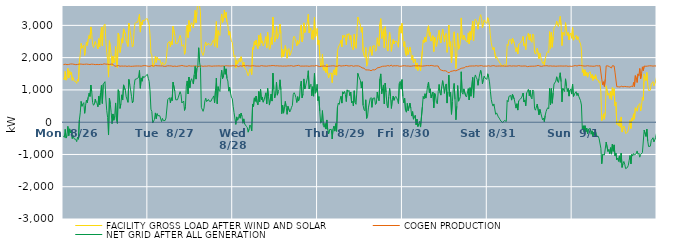
| Category | FACILITY GROSS LOAD AFTER WIND AND SOLAR | COGEN PRODUCTION | NET GRID AFTER ALL GENERATION |
|---|---|---|---|
|  Mon  8/26 | 1358 | 1783 | -425 |
|  Mon  8/26 | 1316 | 1786 | -470 |
|  Mon  8/26 | 1574 | 1796 | -222 |
|  Mon  8/26 | 1303 | 1795 | -492 |
|  Mon  8/26 | 1369 | 1783 | -414 |
|  Mon  8/26 | 1669 | 1799 | -130 |
|  Mon  8/26 | 1369 | 1789 | -420 |
|  Mon  8/26 | 1591 | 1798 | -207 |
|  Mon  8/26 | 1475 | 1802 | -327 |
|  Mon  8/26 | 1544 | 1790 | -246 |
|  Mon  8/26 | 1298 | 1803 | -505 |
|  Mon  8/26 | 1380 | 1794 | -414 |
|  Mon  8/26 | 1280 | 1793 | -513 |
|  Mon  8/26 | 1264 | 1791 | -527 |
|  Mon  8/26 | 1251 | 1782 | -531 |
|  Mon  8/26 | 1202 | 1805 | -603 |
|  Mon  8/26 | 1325 | 1789 | -464 |
|  Mon  8/26 | 1268 | 1798 | -530 |
|  Mon  8/26 | 1870 | 1800 | 70 |
|  Mon  8/26 | 2092 | 1803 | 289 |
|  Mon  8/26 | 2443 | 1800 | 643 |
|  Mon  8/26 | 2288 | 1797 | 491 |
|  Mon  8/26 | 2359 | 1792 | 567 |
|  Mon  8/26 | 2393 | 1788 | 605 |
|  Mon  8/26 | 2069 | 1794 | 275 |
|  Mon  8/26 | 2311 | 1796 | 515 |
|  Mon  8/26 | 2485 | 1800 | 685 |
|  Mon  8/26 | 2379 | 1775 | 604 |
|  Mon  8/26 | 2568 | 1794 | 774 |
|  Mon  8/26 | 2690 | 1793 | 897 |
|  Mon  8/26 | 2583 | 1786 | 797 |
|  Mon  8/26 | 2952 | 1800 | 1152 |
|  Mon  8/26 | 2745 | 1799 | 946 |
|  Mon  8/26 | 2401 | 1796 | 605 |
|  Mon  8/26 | 2317 | 1793 | 524 |
|  Mon  8/26 | 2336 | 1772 | 564 |
|  Mon  8/26 | 2500 | 1784 | 716 |
|  Mon  8/26 | 2402 | 1793 | 609 |
|  Mon  8/26 | 2364 | 1790 | 574 |
|  Mon  8/26 | 2271 | 1794 | 477 |
|  Mon  8/26 | 2589 | 1784 | 805 |
|  Mon  8/26 | 2331 | 1790 | 541 |
|  Mon  8/26 | 2705 | 1792 | 913 |
|  Mon  8/26 | 2941 | 1801 | 1140 |
|  Mon  8/26 | 2368 | 1788 | 580 |
|  Mon  8/26 | 2959 | 1786 | 1173 |
|  Mon  8/26 | 2982 | 1809 | 1173 |
|  Mon  8/26 | 3039 | 1784 | 1255 |
|  Mon  8/26 | 2516 | 1798 | 718 |
|  Mon  8/26 | 2153 | 1795 | 358 |
|  Mon  8/26 | 1938 | 1797 | 141 |
|  Mon  8/26 | 1396 | 1794 | -398 |
|  Mon  8/26 | 2524 | 1785 | 739 |
|  Mon  8/26 | 2341 | 1775 | 566 |
|  Mon  8/26 | 2102 | 1800 | 302 |
|  Mon  8/26 | 1739 | 1786 | -47 |
|  Mon  8/26 | 2051 | 1796 | 255 |
|  Mon  8/26 | 1841 | 1782 | 59 |
|  Mon  8/26 | 1919 | 1735 | 184 |
|  Mon  8/26 | 2344 | 1748 | 596 |
|  Mon  8/26 | 1811 | 1740 | 71 |
|  Mon  8/26 | 1690 | 1729 | -39 |
|  Mon  8/26 | 2760 | 1755 | 1005 |
|  Mon  8/26 | 2671 | 1738 | 933 |
|  Mon  8/26 | 2159 | 1734 | 425 |
|  Mon  8/26 | 2326 | 1752 | 574 |
|  Mon  8/26 | 2588 | 1740 | 848 |
|  Mon  8/26 | 2451 | 1765 | 686 |
|  Mon  8/26 | 2892 | 1736 | 1156 |
|  Mon  8/26 | 2875 | 1741 | 1134 |
|  Mon  8/26 | 2735 | 1741 | 994 |
|  Mon  8/26 | 2524 | 1738 | 786 |
|  Mon  8/26 | 2504 | 1729 | 775 |
|  Mon  8/26 | 2346 | 1731 | 615 |
|  Mon  8/26 | 3065 | 1741 | 1324 |
|  Mon  8/26 | 2905 | 1737 | 1168 |
|  Mon  8/26 | 2730 | 1730 | 1000 |
|  Mon  8/26 | 2543 | 1740 | 803 |
|  Mon  8/26 | 2328 | 1732 | 596 |
|  Mon  8/26 | 2400 | 1731 | 669 |
|  Mon  8/26 | 2871 | 1737 | 1134 |
|  Mon  8/26 | 3061 | 1737 | 1324 |
|  Mon  8/26 | 3093 | 1740 | 1353 |
|  Mon  8/26 | 3083 | 1736 | 1347 |
|  Mon  8/26 | 3101 | 1741 | 1360 |
|  Mon  8/26 | 3125 | 1739 | 1386 |
|  Mon  8/26 | 3342 | 1740 | 1602 |
|  Mon  8/26 | 2791 | 1740 | 1051 |
|  Mon  8/26 | 3107 | 1735 | 1372 |
|  Mon  8/26 | 3017 | 1748 | 1269 |
|  Mon  8/26 | 3166 | 1747 | 1419 |
|  Mon  8/26 | 3131 | 1753 | 1378 |
|  Mon  8/26 | 3105 | 1754 | 1351 |
|  Mon  8/26 | 3194 | 1756 | 1438 |
|  Mon  8/26 | 3183 | 1744 | 1439 |
|  Mon  8/26 | 3205 | 1724 | 1481 |
|  Tue  8/27 | 3090 | 1732 | 1358 |
|  Tue  8/27 | 3007 | 1746 | 1261 |
|  Tue  8/27 | 2693 | 1733 | 960 |
|  Tue  8/27 | 2141 | 1741 | 400 |
|  Tue  8/27 | 2087 | 1754 | 333 |
|  Tue  8/27 | 1714 | 1740 | -26 |
|  Tue  8/27 | 1722 | 1735 | -13 |
|  Tue  8/27 | 1836 | 1748 | 88 |
|  Tue  8/27 | 2041 | 1754 | 287 |
|  Tue  8/27 | 1852 | 1744 | 108 |
|  Tue  8/27 | 2014 | 1748 | 266 |
|  Tue  8/27 | 1944 | 1741 | 203 |
|  Tue  8/27 | 1960 | 1745 | 215 |
|  Tue  8/27 | 1945 | 1745 | 200 |
|  Tue  8/27 | 1926 | 1743 | 183 |
|  Tue  8/27 | 1766 | 1747 | 19 |
|  Tue  8/27 | 1861 | 1743 | 118 |
|  Tue  8/27 | 1791 | 1743 | 48 |
|  Tue  8/27 | 1767 | 1730 | 37 |
|  Tue  8/27 | 1795 | 1743 | 52 |
|  Tue  8/27 | 1861 | 1733 | 128 |
|  Tue  8/27 | 1866 | 1743 | 123 |
|  Tue  8/27 | 2447 | 1748 | 699 |
|  Tue  8/27 | 2430 | 1738 | 692 |
|  Tue  8/27 | 2503 | 1745 | 758 |
|  Tue  8/27 | 2336 | 1734 | 602 |
|  Tue  8/27 | 2501 | 1743 | 758 |
|  Tue  8/27 | 2406 | 1737 | 669 |
|  Tue  8/27 | 2970 | 1729 | 1241 |
|  Tue  8/27 | 2975 | 1758 | 1217 |
|  Tue  8/27 | 2698 | 1738 | 960 |
|  Tue  8/27 | 2442 | 1748 | 694 |
|  Tue  8/27 | 2450 | 1727 | 723 |
|  Tue  8/27 | 2439 | 1745 | 694 |
|  Tue  8/27 | 2515 | 1739 | 776 |
|  Tue  8/27 | 2529 | 1736 | 793 |
|  Tue  8/27 | 2690 | 1744 | 946 |
|  Tue  8/27 | 2597 | 1741 | 856 |
|  Tue  8/27 | 2352 | 1758 | 594 |
|  Tue  8/27 | 2348 | 1737 | 611 |
|  Tue  8/27 | 2399 | 1743 | 656 |
|  Tue  8/27 | 2104 | 1740 | 364 |
|  Tue  8/27 | 2209 | 1735 | 474 |
|  Tue  8/27 | 2864 | 1746 | 1118 |
|  Tue  8/27 | 3009 | 1731 | 1278 |
|  Tue  8/27 | 2622 | 1747 | 875 |
|  Tue  8/27 | 3149 | 1750 | 1399 |
|  Tue  8/27 | 2811 | 1745 | 1066 |
|  Tue  8/27 | 3020 | 1738 | 1282 |
|  Tue  8/27 | 3081 | 1734 | 1347 |
|  Tue  8/27 | 2997 | 1738 | 1259 |
|  Tue  8/27 | 2925 | 1743 | 1182 |
|  Tue  8/27 | 3214 | 1741 | 1473 |
|  Tue  8/27 | 3467 | 1736 | 1731 |
|  Tue  8/27 | 3080 | 1745 | 1335 |
|  Tue  8/27 | 3420 | 1748 | 1672 |
|  Tue  8/27 | 3441 | 1721 | 1720 |
|  Tue  8/27 | 4053 | 1747 | 2306 |
|  Tue  8/27 | 3587 | 1735 | 1852 |
|  Tue  8/27 | 3427 | 1735 | 1692 |
|  Tue  8/27 | 2204 | 1744 | 460 |
|  Tue  8/27 | 2211 | 1745 | 466 |
|  Tue  8/27 | 2066 | 1730 | 336 |
|  Tue  8/27 | 2170 | 1737 | 433 |
|  Tue  8/27 | 2394 | 1739 | 655 |
|  Tue  8/27 | 2485 | 1741 | 744 |
|  Tue  8/27 | 2372 | 1735 | 637 |
|  Tue  8/27 | 2366 | 1745 | 621 |
|  Tue  8/27 | 2450 | 1746 | 704 |
|  Tue  8/27 | 2395 | 1745 | 650 |
|  Tue  8/27 | 2373 | 1741 | 632 |
|  Tue  8/27 | 2387 | 1737 | 650 |
|  Tue  8/27 | 2455 | 1733 | 722 |
|  Tue  8/27 | 2516 | 1759 | 757 |
|  Tue  8/27 | 2554 | 1740 | 814 |
|  Tue  8/27 | 2350 | 1749 | 601 |
|  Tue  8/27 | 2728 | 1741 | 987 |
|  Tue  8/27 | 3120 | 1751 | 1369 |
|  Tue  8/27 | 2315 | 1742 | 573 |
|  Tue  8/27 | 2839 | 1739 | 1100 |
|  Tue  8/27 | 2730 | 1745 | 985 |
|  Tue  8/27 | 2686 | 1733 | 953 |
|  Tue  8/27 | 3122 | 1738 | 1384 |
|  Tue  8/27 | 3353 | 1742 | 1611 |
|  Tue  8/27 | 3089 | 1743 | 1346 |
|  Tue  8/27 | 3139 | 1747 | 1392 |
|  Tue  8/27 | 3475 | 1738 | 1737 |
|  Tue  8/27 | 3226 | 1742 | 1484 |
|  Tue  8/27 | 3402 | 1749 | 1653 |
|  Tue  8/27 | 3104 | 1750 | 1354 |
|  Tue  8/27 | 3018 | 1744 | 1274 |
|  Tue  8/27 | 2697 | 1735 | 962 |
|  Tue  8/27 | 2825 | 1741 | 1084 |
|  Tue  8/27 | 2643 | 1741 | 902 |
|  Tue  8/27 | 2520 | 1743 | 777 |
|  Tue  8/27 | 2472 | 1746 | 726 |
|  Wed  8/28 | 2242 | 1750 | 492 |
|  Wed  8/28 | 2026 | 1729 | 297 |
|  Wed  8/28 | 2064 | 1740 | 324 |
|  Wed  8/28 | 1679 | 1747 | -68 |
|  Wed  8/28 | 1914 | 1751 | 163 |
|  Wed  8/28 | 1803 | 1743 | 60 |
|  Wed  8/28 | 1830 | 1723 | 107 |
|  Wed  8/28 | 1980 | 1735 | 245 |
|  Wed  8/28 | 1870 | 1747 | 123 |
|  Wed  8/28 | 2028 | 1748 | 280 |
|  Wed  8/28 | 1915 | 1736 | 179 |
|  Wed  8/28 | 1706 | 1739 | -33 |
|  Wed  8/28 | 1858 | 1756 | 102 |
|  Wed  8/28 | 1681 | 1734 | -53 |
|  Wed  8/28 | 1700 | 1746 | -46 |
|  Wed  8/28 | 1603 | 1734 | -131 |
|  Wed  8/28 | 1581 | 1751 | -170 |
|  Wed  8/28 | 1434 | 1743 | -309 |
|  Wed  8/28 | 1524 | 1742 | -218 |
|  Wed  8/28 | 1649 | 1736 | -87 |
|  Wed  8/28 | 1596 | 1740 | -144 |
|  Wed  8/28 | 1475 | 1745 | -270 |
|  Wed  8/28 | 2314 | 1750 | 564 |
|  Wed  8/28 | 2243 | 1756 | 487 |
|  Wed  8/28 | 2499 | 1745 | 754 |
|  Wed  8/28 | 2391 | 1744 | 647 |
|  Wed  8/28 | 2547 | 1737 | 810 |
|  Wed  8/28 | 2349 | 1738 | 611 |
|  Wed  8/28 | 2275 | 1738 | 537 |
|  Wed  8/28 | 2698 | 1748 | 950 |
|  Wed  8/28 | 2370 | 1735 | 635 |
|  Wed  8/28 | 2746 | 1731 | 1015 |
|  Wed  8/28 | 2451 | 1753 | 698 |
|  Wed  8/28 | 2520 | 1739 | 781 |
|  Wed  8/28 | 2361 | 1742 | 619 |
|  Wed  8/28 | 2434 | 1745 | 689 |
|  Wed  8/28 | 2540 | 1739 | 801 |
|  Wed  8/28 | 2652 | 1742 | 910 |
|  Wed  8/28 | 2304 | 1736 | 568 |
|  Wed  8/28 | 2788 | 1738 | 1050 |
|  Wed  8/28 | 2544 | 1746 | 798 |
|  Wed  8/28 | 2258 | 1728 | 530 |
|  Wed  8/28 | 2290 | 1746 | 544 |
|  Wed  8/28 | 2621 | 1749 | 872 |
|  Wed  8/28 | 2408 | 1754 | 654 |
|  Wed  8/28 | 3259 | 1739 | 1520 |
|  Wed  8/28 | 2771 | 1753 | 1018 |
|  Wed  8/28 | 2485 | 1734 | 751 |
|  Wed  8/28 | 2635 | 1745 | 890 |
|  Wed  8/28 | 2973 | 1732 | 1241 |
|  Wed  8/28 | 2585 | 1748 | 837 |
|  Wed  8/28 | 2703 | 1753 | 950 |
|  Wed  8/28 | 2753 | 1740 | 1013 |
|  Wed  8/28 | 3042 | 1729 | 1313 |
|  Wed  8/28 | 2748 | 1743 | 1005 |
|  Wed  8/28 | 2010 | 1747 | 263 |
|  Wed  8/28 | 2257 | 1736 | 521 |
|  Wed  8/28 | 2027 | 1747 | 280 |
|  Wed  8/28 | 2221 | 1740 | 481 |
|  Wed  8/28 | 2376 | 1733 | 643 |
|  Wed  8/28 | 2207 | 1737 | 470 |
|  Wed  8/28 | 1979 | 1735 | 244 |
|  Wed  8/28 | 2237 | 1746 | 491 |
|  Wed  8/28 | 2281 | 1772 | 509 |
|  Wed  8/28 | 2062 | 1745 | 317 |
|  Wed  8/28 | 2112 | 1745 | 367 |
|  Wed  8/28 | 2214 | 1751 | 463 |
|  Wed  8/28 | 2260 | 1742 | 518 |
|  Wed  8/28 | 2593 | 1732 | 861 |
|  Wed  8/28 | 2664 | 1751 | 913 |
|  Wed  8/28 | 2598 | 1742 | 856 |
|  Wed  8/28 | 2504 | 1744 | 760 |
|  Wed  8/28 | 2364 | 1753 | 611 |
|  Wed  8/28 | 2529 | 1738 | 791 |
|  Wed  8/28 | 2416 | 1761 | 655 |
|  Wed  8/28 | 2466 | 1744 | 722 |
|  Wed  8/28 | 2854 | 1737 | 1117 |
|  Wed  8/28 | 3013 | 1742 | 1271 |
|  Wed  8/28 | 2493 | 1738 | 755 |
|  Wed  8/28 | 2618 | 1747 | 871 |
|  Wed  8/28 | 3078 | 1737 | 1341 |
|  Wed  8/28 | 2776 | 1749 | 1027 |
|  Wed  8/28 | 2870 | 1740 | 1130 |
|  Wed  8/28 | 2863 | 1732 | 1131 |
|  Wed  8/28 | 3112 | 1739 | 1373 |
|  Wed  8/28 | 3344 | 1750 | 1594 |
|  Wed  8/28 | 2764 | 1731 | 1033 |
|  Wed  8/28 | 2883 | 1751 | 1132 |
|  Wed  8/28 | 2917 | 1742 | 1175 |
|  Wed  8/28 | 2568 | 1752 | 816 |
|  Wed  8/28 | 2843 | 1744 | 1099 |
|  Wed  8/28 | 2556 | 1751 | 805 |
|  Wed  8/28 | 3249 | 1740 | 1509 |
|  Wed  8/28 | 2636 | 1739 | 897 |
|  Wed  8/28 | 2711 | 1756 | 955 |
|  Wed  8/28 | 2906 | 1733 | 1173 |
|  Thu  8/29 | 2405 | 1738 | 667 |
|  Thu  8/29 | 2542 | 1750 | 792 |
|  Thu  8/29 | 2059 | 1723 | 336 |
|  Thu  8/29 | 1709 | 1739 | -30 |
|  Thu  8/29 | 1782 | 1734 | 48 |
|  Thu  8/29 | 2113 | 1754 | 359 |
|  Thu  8/29 | 1640 | 1738 | -98 |
|  Thu  8/29 | 1597 | 1755 | -158 |
|  Thu  8/29 | 1709 | 1744 | -35 |
|  Thu  8/29 | 1538 | 1752 | -214 |
|  Thu  8/29 | 1796 | 1727 | 69 |
|  Thu  8/29 | 1495 | 1733 | -238 |
|  Thu  8/29 | 1374 | 1736 | -362 |
|  Thu  8/29 | 1506 | 1738 | -232 |
|  Thu  8/29 | 1520 | 1740 | -220 |
|  Thu  8/29 | 1524 | 1746 | -222 |
|  Thu  8/29 | 1226 | 1746 | -520 |
|  Thu  8/29 | 1527 | 1742 | -215 |
|  Thu  8/29 | 1625 | 1746 | -121 |
|  Thu  8/29 | 1463 | 1740 | -277 |
|  Thu  8/29 | 1689 | 1734 | -45 |
|  Thu  8/29 | 1454 | 1738 | -284 |
|  Thu  8/29 | 2201 | 1734 | 467 |
|  Thu  8/29 | 2332 | 1738 | 594 |
|  Thu  8/29 | 2308 | 1758 | 550 |
|  Thu  8/29 | 2438 | 1730 | 708 |
|  Thu  8/29 | 2541 | 1738 | 803 |
|  Thu  8/29 | 2334 | 1743 | 591 |
|  Thu  8/29 | 2686 | 1746 | 940 |
|  Thu  8/29 | 2628 | 1747 | 881 |
|  Thu  8/29 | 2702 | 1749 | 953 |
|  Thu  8/29 | 2606 | 1749 | 857 |
|  Thu  8/29 | 2398 | 1759 | 639 |
|  Thu  8/29 | 2734 | 1732 | 1002 |
|  Thu  8/29 | 2695 | 1743 | 952 |
|  Thu  8/29 | 2748 | 1762 | 986 |
|  Thu  8/29 | 2564 | 1742 | 822 |
|  Thu  8/29 | 2686 | 1752 | 934 |
|  Thu  8/29 | 2356 | 1754 | 602 |
|  Thu  8/29 | 2372 | 1727 | 645 |
|  Thu  8/29 | 2236 | 1732 | 504 |
|  Thu  8/29 | 2725 | 1752 | 973 |
|  Thu  8/29 | 2352 | 1745 | 607 |
|  Thu  8/29 | 2290 | 1736 | 554 |
|  Thu  8/29 | 2736 | 1745 | 991 |
|  Thu  8/29 | 3257 | 1743 | 1514 |
|  Thu  8/29 | 3165 | 1742 | 1423 |
|  Thu  8/29 | 3183 | 1744 | 1439 |
|  Thu  8/29 | 3005 | 1719 | 1286 |
|  Thu  8/29 | 2786 | 1728 | 1058 |
|  Thu  8/29 | 2937 | 1683 | 1254 |
|  Thu  8/29 | 2188 | 1666 | 522 |
|  Thu  8/29 | 2063 | 1672 | 391 |
|  Thu  8/29 | 2009 | 1655 | 354 |
|  Thu  8/29 | 2314 | 1620 | 694 |
|  Thu  8/29 | 1736 | 1621 | 115 |
|  Thu  8/29 | 1787 | 1619 | 168 |
|  Thu  8/29 | 2062 | 1619 | 443 |
|  Thu  8/29 | 2089 | 1616 | 473 |
|  Thu  8/29 | 2339 | 1610 | 729 |
|  Thu  8/29 | 2356 | 1594 | 762 |
|  Thu  8/29 | 2072 | 1612 | 460 |
|  Thu  8/29 | 2361 | 1625 | 736 |
|  Thu  8/29 | 2368 | 1624 | 744 |
|  Thu  8/29 | 2375 | 1620 | 755 |
|  Thu  8/29 | 2196 | 1648 | 548 |
|  Thu  8/29 | 2228 | 1648 | 580 |
|  Thu  8/29 | 2615 | 1684 | 931 |
|  Thu  8/29 | 2417 | 1669 | 748 |
|  Thu  8/29 | 2356 | 1692 | 664 |
|  Thu  8/29 | 3035 | 1697 | 1338 |
|  Thu  8/29 | 3208 | 1711 | 1497 |
|  Thu  8/29 | 2594 | 1717 | 877 |
|  Thu  8/29 | 2767 | 1732 | 1035 |
|  Thu  8/29 | 2893 | 1738 | 1155 |
|  Thu  8/29 | 2303 | 1736 | 567 |
|  Thu  8/29 | 2959 | 1746 | 1213 |
|  Thu  8/29 | 2666 | 1737 | 929 |
|  Thu  8/29 | 2276 | 1745 | 531 |
|  Thu  8/29 | 2203 | 1755 | 448 |
|  Thu  8/29 | 2539 | 1748 | 791 |
|  Thu  8/29 | 2785 | 1739 | 1046 |
|  Thu  8/29 | 2525 | 1732 | 793 |
|  Thu  8/29 | 2196 | 1770 | 426 |
|  Thu  8/29 | 2422 | 1734 | 688 |
|  Thu  8/29 | 2564 | 1754 | 810 |
|  Thu  8/29 | 2427 | 1749 | 678 |
|  Thu  8/29 | 2514 | 1749 | 765 |
|  Thu  8/29 | 2544 | 1746 | 798 |
|  Thu  8/29 | 2499 | 1741 | 758 |
|  Thu  8/29 | 2431 | 1751 | 680 |
|  Thu  8/29 | 2323 | 1745 | 578 |
|  Thu  8/29 | 2934 | 1733 | 1201 |
|  Thu  8/29 | 2989 | 1726 | 1263 |
|  Thu  8/29 | 2757 | 1733 | 1024 |
|  Thu  8/29 | 3064 | 1745 | 1319 |
|  Fri  8/30 | 2544 | 1747 | 797 |
|  Fri  8/30 | 2344 | 1747 | 597 |
|  Fri  8/30 | 2498 | 1751 | 747 |
|  Fri  8/30 | 2121 | 1757 | 364 |
|  Fri  8/30 | 2048 | 1740 | 308 |
|  Fri  8/30 | 2319 | 1735 | 584 |
|  Fri  8/30 | 2098 | 1741 | 357 |
|  Fri  8/30 | 2100 | 1744 | 356 |
|  Fri  8/30 | 2322 | 1733 | 589 |
|  Fri  8/30 | 2168 | 1737 | 431 |
|  Fri  8/30 | 1927 | 1737 | 190 |
|  Fri  8/30 | 2065 | 1737 | 328 |
|  Fri  8/30 | 1838 | 1747 | 91 |
|  Fri  8/30 | 1821 | 1750 | 71 |
|  Fri  8/30 | 1958 | 1747 | 211 |
|  Fri  8/30 | 1659 | 1741 | -82 |
|  Fri  8/30 | 1836 | 1743 | 93 |
|  Fri  8/30 | 1602 | 1737 | -135 |
|  Fri  8/30 | 1699 | 1748 | -49 |
|  Fri  8/30 | 1761 | 1738 | 23 |
|  Fri  8/30 | 1589 | 1740 | -151 |
|  Fri  8/30 | 1596 | 1751 | -155 |
|  Fri  8/30 | 2205 | 1737 | 468 |
|  Fri  8/30 | 2549 | 1753 | 796 |
|  Fri  8/30 | 2467 | 1743 | 724 |
|  Fri  8/30 | 2635 | 1753 | 882 |
|  Fri  8/30 | 2496 | 1750 | 746 |
|  Fri  8/30 | 2665 | 1753 | 912 |
|  Fri  8/30 | 2891 | 1754 | 1137 |
|  Fri  8/30 | 2989 | 1744 | 1245 |
|  Fri  8/30 | 2664 | 1749 | 915 |
|  Fri  8/30 | 2777 | 1743 | 1034 |
|  Fri  8/30 | 2513 | 1760 | 753 |
|  Fri  8/30 | 2590 | 1740 | 850 |
|  Fri  8/30 | 2682 | 1749 | 933 |
|  Fri  8/30 | 2190 | 1745 | 445 |
|  Fri  8/30 | 2627 | 1737 | 890 |
|  Fri  8/30 | 2555 | 1739 | 816 |
|  Fri  8/30 | 2347 | 1744 | 603 |
|  Fri  8/30 | 2330 | 1761 | 569 |
|  Fri  8/30 | 2694 | 1739 | 955 |
|  Fri  8/30 | 2847 | 1678 | 1169 |
|  Fri  8/30 | 2541 | 1631 | 910 |
|  Fri  8/30 | 2452 | 1614 | 838 |
|  Fri  8/30 | 2716 | 1607 | 1109 |
|  Fri  8/30 | 2885 | 1598 | 1287 |
|  Fri  8/30 | 2689 | 1592 | 1097 |
|  Fri  8/30 | 2490 | 1596 | 894 |
|  Fri  8/30 | 2706 | 1595 | 1111 |
|  Fri  8/30 | 2753 | 1568 | 1185 |
|  Fri  8/30 | 2163 | 1571 | 592 |
|  Fri  8/30 | 2473 | 1537 | 936 |
|  Fri  8/30 | 3010 | 1550 | 1460 |
|  Fri  8/30 | 2345 | 1543 | 802 |
|  Fri  8/30 | 2495 | 1574 | 921 |
|  Fri  8/30 | 1835 | 1591 | 244 |
|  Fri  8/30 | 2216 | 1583 | 633 |
|  Fri  8/30 | 2609 | 1596 | 1013 |
|  Fri  8/30 | 2800 | 1600 | 1200 |
|  Fri  8/30 | 2319 | 1613 | 706 |
|  Fri  8/30 | 1664 | 1590 | 74 |
|  Fri  8/30 | 2102 | 1606 | 496 |
|  Fri  8/30 | 2751 | 1616 | 1135 |
|  Fri  8/30 | 2260 | 1611 | 649 |
|  Fri  8/30 | 2337 | 1639 | 698 |
|  Fri  8/30 | 2458 | 1661 | 797 |
|  Fri  8/30 | 3231 | 1669 | 1562 |
|  Fri  8/30 | 2596 | 1674 | 922 |
|  Fri  8/30 | 2546 | 1679 | 867 |
|  Fri  8/30 | 2696 | 1663 | 1033 |
|  Fri  8/30 | 2712 | 1689 | 1023 |
|  Fri  8/30 | 2537 | 1722 | 815 |
|  Fri  8/30 | 2523 | 1743 | 780 |
|  Fri  8/30 | 2478 | 1720 | 758 |
|  Fri  8/30 | 2767 | 1726 | 1041 |
|  Fri  8/30 | 2426 | 1737 | 689 |
|  Fri  8/30 | 2810 | 1741 | 1069 |
|  Fri  8/30 | 2544 | 1740 | 804 |
|  Fri  8/30 | 2532 | 1738 | 794 |
|  Fri  8/30 | 3128 | 1742 | 1386 |
|  Fri  8/30 | 2515 | 1753 | 762 |
|  Fri  8/30 | 3099 | 1740 | 1359 |
|  Fri  8/30 | 3197 | 1733 | 1464 |
|  Fri  8/30 | 3138 | 1751 | 1387 |
|  Fri  8/30 | 3078 | 1748 | 1330 |
|  Fri  8/30 | 2881 | 1738 | 1143 |
|  Fri  8/30 | 3090 | 1742 | 1348 |
|  Fri  8/30 | 3251 | 1748 | 1503 |
|  Fri  8/30 | 3332 | 1727 | 1605 |
|  Fri  8/30 | 3215 | 1753 | 1462 |
|  Fri  8/30 | 2920 | 1732 | 1188 |
|  Fri  8/30 | 3061 | 1734 | 1327 |
|  Fri  8/30 | 3170 | 1741 | 1429 |
|  Fri  8/30 | 3103 | 1739 | 1364 |
|  Fri  8/30 | 3073 | 1736 | 1337 |
|  Fri  8/30 | 3065 | 1736 | 1329 |
|  Sat  8/31 | 3239 | 1740 | 1499 |
|  Sat  8/31 | 3143 | 1749 | 1394 |
|  Sat  8/31 | 2988 | 1739 | 1249 |
|  Sat  8/31 | 2692 | 1733 | 959 |
|  Sat  8/31 | 2462 | 1758 | 704 |
|  Sat  8/31 | 2322 | 1747 | 575 |
|  Sat  8/31 | 2240 | 1742 | 498 |
|  Sat  8/31 | 2318 | 1752 | 566 |
|  Sat  8/31 | 2328 | 1741 | 587 |
|  Sat  8/31 | 1979 | 1736 | 243 |
|  Sat  8/31 | 2030 | 1742 | 288 |
|  Sat  8/31 | 2036 | 1738 | 298 |
|  Sat  8/31 | 1906 | 1743 | 163 |
|  Sat  8/31 | 1867 | 1741 | 126 |
|  Sat  8/31 | 1829 | 1754 | 75 |
|  Sat  8/31 | 1770 | 1739 | 31 |
|  Sat  8/31 | 1760 | 1754 | 6 |
|  Sat  8/31 | 1730 | 1743 | -13 |
|  Sat  8/31 | 1724 | 1739 | -15 |
|  Sat  8/31 | 1791 | 1737 | 54 |
|  Sat  8/31 | 1781 | 1735 | 46 |
|  Sat  8/31 | 1756 | 1735 | 21 |
|  Sat  8/31 | 2413 | 1738 | 675 |
|  Sat  8/31 | 2369 | 1739 | 630 |
|  Sat  8/31 | 2544 | 1744 | 800 |
|  Sat  8/31 | 2521 | 1747 | 774 |
|  Sat  8/31 | 2563 | 1736 | 827 |
|  Sat  8/31 | 2420 | 1737 | 683 |
|  Sat  8/31 | 2602 | 1736 | 866 |
|  Sat  8/31 | 2626 | 1744 | 882 |
|  Sat  8/31 | 2457 | 1744 | 713 |
|  Sat  8/31 | 2450 | 1740 | 710 |
|  Sat  8/31 | 2186 | 1750 | 436 |
|  Sat  8/31 | 2309 | 1738 | 571 |
|  Sat  8/31 | 2115 | 1740 | 375 |
|  Sat  8/31 | 2416 | 1753 | 663 |
|  Sat  8/31 | 2406 | 1763 | 643 |
|  Sat  8/31 | 2455 | 1740 | 715 |
|  Sat  8/31 | 2502 | 1749 | 753 |
|  Sat  8/31 | 2547 | 1737 | 810 |
|  Sat  8/31 | 2657 | 1754 | 903 |
|  Sat  8/31 | 2366 | 1741 | 625 |
|  Sat  8/31 | 2430 | 1743 | 687 |
|  Sat  8/31 | 2246 | 1740 | 506 |
|  Sat  8/31 | 2642 | 1742 | 900 |
|  Sat  8/31 | 2679 | 1721 | 958 |
|  Sat  8/31 | 2757 | 1738 | 1019 |
|  Sat  8/31 | 2551 | 1732 | 819 |
|  Sat  8/31 | 2725 | 1738 | 987 |
|  Sat  8/31 | 2513 | 1735 | 778 |
|  Sat  8/31 | 2473 | 1753 | 720 |
|  Sat  8/31 | 2733 | 1735 | 998 |
|  Sat  8/31 | 2699 | 1750 | 949 |
|  Sat  8/31 | 2154 | 1736 | 418 |
|  Sat  8/31 | 2108 | 1736 | 372 |
|  Sat  8/31 | 2132 | 1743 | 389 |
|  Sat  8/31 | 2294 | 1731 | 563 |
|  Sat  8/31 | 2300 | 1760 | 540 |
|  Sat  8/31 | 1969 | 1740 | 229 |
|  Sat  8/31 | 2134 | 1738 | 396 |
|  Sat  8/31 | 2023 | 1737 | 286 |
|  Sat  8/31 | 2016 | 1731 | 285 |
|  Sat  8/31 | 1822 | 1748 | 74 |
|  Sat  8/31 | 1871 | 1744 | 127 |
|  Sat  8/31 | 1760 | 1746 | 14 |
|  Sat  8/31 | 1956 | 1748 | 208 |
|  Sat  8/31 | 2060 | 1732 | 328 |
|  Sat  8/31 | 2155 | 1750 | 405 |
|  Sat  8/31 | 2189 | 1741 | 448 |
|  Sat  8/31 | 2154 | 1738 | 416 |
|  Sat  8/31 | 2806 | 1758 | 1048 |
|  Sat  8/31 | 2277 | 1745 | 532 |
|  Sat  8/31 | 2784 | 1740 | 1044 |
|  Sat  8/31 | 2322 | 1736 | 586 |
|  Sat  8/31 | 2649 | 1746 | 903 |
|  Sat  8/31 | 2922 | 1740 | 1182 |
|  Sat  8/31 | 2898 | 1742 | 1156 |
|  Sat  8/31 | 3004 | 1733 | 1271 |
|  Sat  8/31 | 3127 | 1721 | 1406 |
|  Sat  8/31 | 3014 | 1738 | 1276 |
|  Sat  8/31 | 2962 | 1732 | 1230 |
|  Sat  8/31 | 2959 | 1740 | 1219 |
|  Sat  8/31 | 3279 | 1748 | 1531 |
|  Sat  8/31 | 2995 | 1741 | 1254 |
|  Sat  8/31 | 2375 | 1746 | 629 |
|  Sat  8/31 | 2788 | 1738 | 1050 |
|  Sat  8/31 | 2813 | 1738 | 1075 |
|  Sat  8/31 | 2686 | 1739 | 947 |
|  Sat  8/31 | 3084 | 1740 | 1344 |
|  Sat  8/31 | 2858 | 1743 | 1115 |
|  Sat  8/31 | 2688 | 1738 | 950 |
|  Sat  8/31 | 2777 | 1731 | 1046 |
|  Sat  8/31 | 2554 | 1747 | 807 |
|  Sat  8/31 | 2731 | 1737 | 994 |
|  Sat  8/31 | 2762 | 1730 | 1032 |
|  Sat  8/31 | 2600 | 1729 | 871 |
|  Sun  9/1 | 2929 | 1749 | 1180 |
|  Sun  9/1 | 2541 | 1742 | 799 |
|  Sun  9/1 | 2613 | 1748 | 865 |
|  Sun  9/1 | 2600 | 1755 | 845 |
|  Sun  9/1 | 2692 | 1747 | 945 |
|  Sun  9/1 | 2561 | 1740 | 821 |
|  Sun  9/1 | 2652 | 1749 | 903 |
|  Sun  9/1 | 2561 | 1762 | 799 |
|  Sun  9/1 | 2563 | 1736 | 827 |
|  Sun  9/1 | 2424 | 1757 | 667 |
|  Sun  9/1 | 2269 | 1737 | 532 |
|  Sun  9/1 | 1544 | 1748 | -204 |
|  Sun  9/1 | 1630 | 1741 | -111 |
|  Sun  9/1 | 1443 | 1739 | -296 |
|  Sun  9/1 | 1624 | 1732 | -108 |
|  Sun  9/1 | 1439 | 1739 | -300 |
|  Sun  9/1 | 1543 | 1728 | -185 |
|  Sun  9/1 | 1395 | 1751 | -356 |
|  Sun  9/1 | 1521 | 1737 | -216 |
|  Sun  9/1 | 1504 | 1739 | -235 |
|  Sun  9/1 | 1561 | 1756 | -195 |
|  Sun  9/1 | 1365 | 1738 | -373 |
|  Sun  9/1 | 1477 | 1744 | -267 |
|  Sun  9/1 | 1295 | 1733 | -438 |
|  Sun  9/1 | 1433 | 1740 | -307 |
|  Sun  9/1 | 1342 | 1735 | -393 |
|  Sun  9/1 | 1468 | 1753 | -285 |
|  Sun  9/1 | 1319 | 1751 | -432 |
|  Sun  9/1 | 1297 | 1736 | -439 |
|  Sun  9/1 | 1306 | 1742 | -436 |
|  Sun  9/1 | 1224 | 1735 | -511 |
|  Sun  9/1 | 1262 | 1752 | -490 |
|  Sun  9/1 | 930 | 1737 | -807 |
|  Sun  9/1 | 45 | 1333 | -1288 |
|  Sun  9/1 | 157 | 1157 | -1000 |
|  Sun  9/1 | 259 | 1252 | -993 |
|  Sun  9/1 | 92 | 1108 | -1016 |
|  Sun  9/1 | 327 | 1329 | -1002 |
|  Sun  9/1 | 1129 | 1745 | -616 |
|  Sun  9/1 | 1157 | 1759 | -602 |
|  Sun  9/1 | 835 | 1744 | -909 |
|  Sun  9/1 | 902 | 1744 | -842 |
|  Sun  9/1 | 735 | 1715 | -980 |
|  Sun  9/1 | 950 | 1740 | -790 |
|  Sun  9/1 | 689 | 1679 | -990 |
|  Sun  9/1 | 1070 | 1750 | -680 |
|  Sun  9/1 | 833 | 1736 | -903 |
|  Sun  9/1 | 1039 | 1742 | -703 |
|  Sun  9/1 | 508 | 1551 | -1043 |
|  Sun  9/1 | 623 | 1578 | -955 |
|  Sun  9/1 | -68 | 1099 | -1167 |
|  Sun  9/1 | -23 | 1086 | -1109 |
|  Sun  9/1 | -118 | 1096 | -1214 |
|  Sun  9/1 | 63 | 1107 | -1044 |
|  Sun  9/1 | -155 | 1088 | -1243 |
|  Sun  9/1 | 162 | 1120 | -958 |
|  Sun  9/1 | -306 | 1095 | -1401 |
|  Sun  9/1 | -192 | 1095 | -1287 |
|  Sun  9/1 | -119 | 1098 | -1217 |
|  Sun  9/1 | -196 | 1109 | -1305 |
|  Sun  9/1 | -351 | 1088 | -1439 |
|  Sun  9/1 | -322 | 1099 | -1421 |
|  Sun  9/1 | -317 | 1089 | -1406 |
|  Sun  9/1 | -242 | 1096 | -1338 |
|  Sun  9/1 | -92 | 1093 | -1185 |
|  Sun  9/1 | 55 | 1089 | -1034 |
|  Sun  9/1 | -195 | 1097 | -1292 |
|  Sun  9/1 | 125 | 1121 | -996 |
|  Sun  9/1 | 43 | 1089 | -1046 |
|  Sun  9/1 | 259 | 1231 | -972 |
|  Sun  9/1 | 93 | 1106 | -1013 |
|  Sun  9/1 | 449 | 1445 | -996 |
|  Sun  9/1 | 417 | 1396 | -979 |
|  Sun  9/1 | 340 | 1231 | -891 |
|  Sun  9/1 | 502 | 1497 | -995 |
|  Sun  9/1 | 473 | 1437 | -964 |
|  Sun  9/1 | 578 | 1663 | -1085 |
|  Sun  9/1 | 350 | 1351 | -1001 |
|  Sun  9/1 | 512 | 1502 | -990 |
|  Sun  9/1 | 770 | 1714 | -944 |
|  Sun  9/1 | 680 | 1598 | -918 |
|  Sun  9/1 | 1494 | 1739 | -245 |
|  Sun  9/1 | 1510 | 1745 | -235 |
|  Sun  9/1 | 1292 | 1732 | -440 |
|  Sun  9/1 | 1539 | 1753 | -214 |
|  Sun  9/1 | 1156 | 1738 | -582 |
|  Sun  9/1 | 981 | 1736 | -755 |
|  Sun  9/1 | 994 | 1748 | -754 |
|  Sun  9/1 | 991 | 1733 | -742 |
|  Sun  9/1 | 1181 | 1746 | -565 |
|  Sun  9/1 | 1197 | 1759 | -562 |
|  Sun  9/1 | 1256 | 1737 | -481 |
|  Sun  9/1 | 1125 | 1739 | -614 |
|  Sun  9/1 | 1195 | 1744 | -549 |
|  Sun  9/1 | 1270 | 1740 | -470 |
|  Sun  9/1 | 1404 | 1739 | -335 |